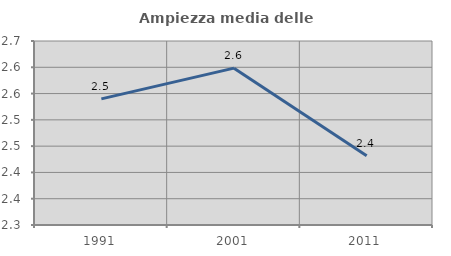
| Category | Ampiezza media delle famiglie |
|---|---|
| 1991.0 | 2.54 |
| 2001.0 | 2.598 |
| 2011.0 | 2.432 |